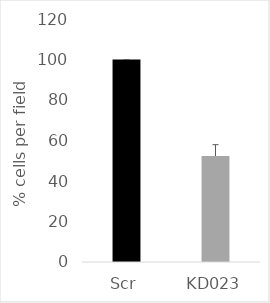
| Category | Series 0 |
|---|---|
| Scr | 100 |
| KD023 | 52.344 |